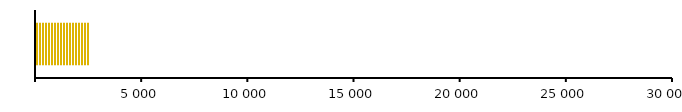
| Category | TOTAL VENTAS | TOTAL INVERSION MARKETING |
|---|---|---|
| 0 | 2532 | 24216 |